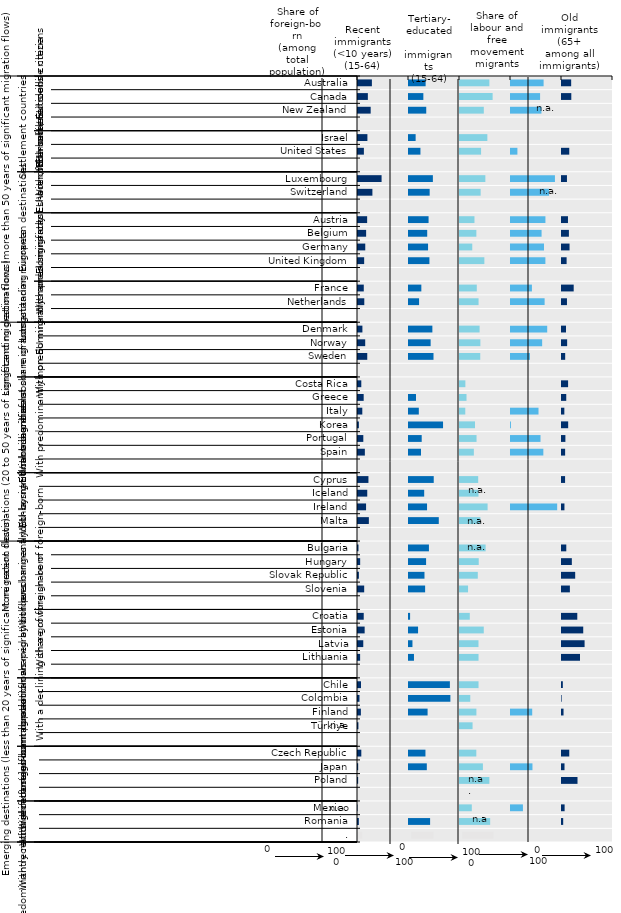
| Category | Foreign-born in the population
2021 | Series 1 | Recent (less than 10 years)
(15-64)
2020 | Series 3 | Tertiary (15-64)
2020 | Series 5 | Labour migrants and free mobility (2015-20) | Series 12 | Older migrants (65+) 2020 | Series 7 |
|---|---|---|---|---|---|---|---|---|---|---|
| 0 | 29.2 | 70.8 | 34.567 | 65.433 | 59.563 | 40.437 | 65.895 | 34.105 | 19.941 | 80.059 |
| 1 | 21.298 | 78.702 | 30.103 | 69.897 | 65.942 | 34.058 | 58.993 | 41.007 | 20.205 | 79.795 |
| 2 | 26.813 | 73.187 | 35.769 | 64.231 | 48.642 | 51.358 | 61.633 | 38.367 | 0 | 100 |
| 3 | 0 | 100 | 0 | 100 | 0 | 100 | 0 | 100 | 0 | 100 |
| 4 | 20.4 | 79.6 | 14.974 | 85.026 | 55.59 | 44.41 | 0 | 100 | 0 | 100 |
| 5 | 13.5 | 86.5 | 24.397 | 75.603 | 43.287 | 56.713 | 14.513 | 85.487 | 16.2 | 83.8 |
| 6 | 0 | 100 | 0 | 100 | 0 | 100 | 0 | 100 | 0 | 100 |
| 7 | 48.2 | 51.8 | 48.771 | 51.229 | 51.677 | 48.323 | 88.115 | 11.885 | 11.675 | 88.325 |
| 8 | 30.2 | 69.8 | 42.49 | 57.51 | 42.431 | 57.569 | 76.639 | 23.361 | 0 | 100 |
| 9 | 0 | 100 | 0 | 100 | 0 | 100 | 0 | 100 | 0 | 100 |
| 10 | 19.9 | 80.1 | 40.346 | 59.654 | 30.329 | 69.671 | 69.449 | 30.551 | 13.67 | 86.33 |
| 11 | 17.9 | 82.1 | 37.666 | 62.334 | 34.037 | 65.963 | 61.92 | 38.08 | 15.49 | 84.51 |
| 12 | 16.2 | 83.8 | 39.337 | 60.663 | 26.01 | 73.99 | 66.656 | 33.344 | 16.755 | 83.245 |
| 13 | 14.041 | 85.959 | 42.001 | 57.999 | 49.718 | 50.282 | 69.389 | 30.611 | 10.99 | 89.01 |
| 14 | 0 | 100 | 0 | 100 | 0 | 100 | 0 | 100 | 0 | 100 |
| 15 | 13.3 | 86.7 | 26.167 | 73.833 | 34.879 | 65.121 | 42.972 | 57.028 | 24.892 | 75.108 |
| 16 | 14.3 | 85.7 | 21.73 | 78.27 | 38.354 | 61.646 | 67.884 | 32.116 | 11.681 | 88.319 |
| 17 | 0 | 100 | 0 | 100 | 0 | 100 | 0 | 100 | 0 | 100 |
| 18 | 10.6 | 89.4 | 47.784 | 52.216 | 40.398 | 59.602 | 72.948 | 27.052 | 9.853 | 90.147 |
| 19 | 16.1 | 83.9 | 44.393 | 55.607 | 41.906 | 58.094 | 63.045 | 36.955 | 12.054 | 87.946 |
| 20 | 20.1 | 79.9 | 49.997 | 50.003 | 41.668 | 58.332 | 39.213 | 60.787 | 8.213 | 91.787 |
| 21 | 0 | 100 | 0 | 100 | 0 | 100 | 0 | 100 | 0 | 100 |
| 22 | 8.43 | 91.57 | 0 | 100 | 12.5 | 87.5 | 0 | 100 | 13.911 | 86.089 |
| 23 | 13.1 | 86.9 | 15.66 | 84.34 | 14.729 | 85.271 | 0 | 100 | 10.308 | 89.692 |
| 24 | 10.4 | 89.6 | 21.202 | 78.798 | 12.311 | 87.689 | 55.901 | 44.099 | 6.55 | 93.45 |
| 25 | 3.683 | 96.317 | 68.719 | 31.281 | 31.423 | 68.577 | 1.826 | 98.174 | 14.071 | 85.929 |
| 26 | 12.382 | 87.618 | 26.864 | 73.136 | 34.403 | 65.597 | 59.827 | 40.173 | 8.61 | 91.39 |
| 27 | 15.4 | 84.6 | 25.484 | 74.516 | 29.106 | 70.894 | 65.37 | 34.63 | 8.095 | 91.905 |
| 28 | 0 | 100 | 0 | 100 | 0 | 100 | 0 | 100 | 0 | 100 |
| 29 | 22.433 | 77.567 | 50.45 | 49.55 | 37.628 | 62.372 | 0 | 100 | 7.998 | 92.002 |
| 30 | 20.1 | 79.9 | 31.747 | 68.253 | 38.228 | 61.772 | 0 | 100 | 0 | 100 |
| 31 | 17.772 | 82.228 | 37.349 | 62.651 | 56.069 | 43.931 | 92.498 | 7.502 | 6.766 | 93.234 |
| 32 | 23.256 | 76.744 | 60.365 | 39.635 | 41.962 | 58.038 | 0 | 100 | 0 | 100 |
| 33 | 0 | 100 | 0 | 100 | 0 | 100 | 0 | 100 | 0 | 100 |
| 34 | 2.92 | 97.08 | 41.042 | 58.958 | 52.181 | 47.819 | 0 | 100 | 10.371 | 89.629 |
| 35 | 6.2 | 93.8 | 35.486 | 64.514 | 38.68 | 61.32 | 0 | 100 | 21.248 | 78.752 |
| 36 | 3.7 | 96.3 | 32.324 | 67.676 | 36.85 | 63.15 | 0 | 100 | 27.821 | 72.179 |
| 37 | 14.1 | 85.9 | 33.573 | 66.427 | 17.736 | 82.264 | 0 | 100 | 17.411 | 82.589 |
| 38 | 0 | 100 | 0 | 100 | 0 | 100 | 0 | 100 | 0 | 100 |
| 39 | 13.181 | 86.819 | 4.107 | 95.893 | 21.169 | 78.831 | 0 | 100 | 31.935 | 68.065 |
| 40 | 15 | 85 | 19.732 | 80.268 | 48.568 | 51.432 | 0 | 100 | 43.605 | 56.395 |
| 41 | 12.3 | 87.7 | 8.729 | 91.271 | 38.198 | 61.802 | 0 | 100 | 46.246 | 53.754 |
| 42 | 6.1 | 93.9 | 11.707 | 88.293 | 38.305 | 61.695 | 0 | 100 | 37.273 | 62.727 |
| 43 | 0 | 100 | 0 | 100 | 0 | 100 | 0 | 100 | 0 | 100 |
| 44 | 7.808 | 92.192 | 82.127 | 17.873 | 38.3 | 61.7 | 0 | 100 | 3.6 | 96.4 |
| 45 | 4.87 | 95.13 | 83.11 | 16.89 | 22.1 | 77.9 | 0 | 100 | 1.2 | 98.8 |
| 46 | 7.6 | 92.4 | 38.419 | 61.581 | 34.125 | 65.875 | 43.548 | 56.452 | 4.971 | 95.029 |
| 47 | 2.767 | 97.233 | 0 | 100 | 26.589 | 73.411 | 0 | 100 | 0 | 100 |
| 48 | 0 | 100 | 0 | 100 | 0 | 100 | 0 | 100 | 0 | 100 |
| 49 | 8.451 | 91.549 | 34.225 | 65.775 | 33.937 | 66.063 | 0 | 100 | 16.18 | 83.82 |
| 50 | 2.29 | 97.71 | 36.89 | 63.11 | 46.859 | 53.141 | 44.045 | 55.955 | 6.887 | 93.113 |
| 51 | 2.244 | 97.756 | 0 | 100 | 59.559 | 40.441 | 0 | 100 | 32.369 | 67.631 |
| 52 | 0 | 100 | 0 | 100 | 0 | 100 | 0 | 100 | 0 | 100 |
| 53 | 0.94 | 99.06 | 0 | 100 | 25.1 | 74.9 | 25.335 | 74.665 | 7.1 | 92.9 |
| 54 | 3.588 | 96.412 | 43.346 | 56.654 | 61.098 | 38.902 | 0 | 100 | 4.312 | 95.688 |
| 55 | 10 | 96.412 | 43.346 | 56.654 | 61.098 | 38.902 | 0 | 100 | 0 | 95.688 |